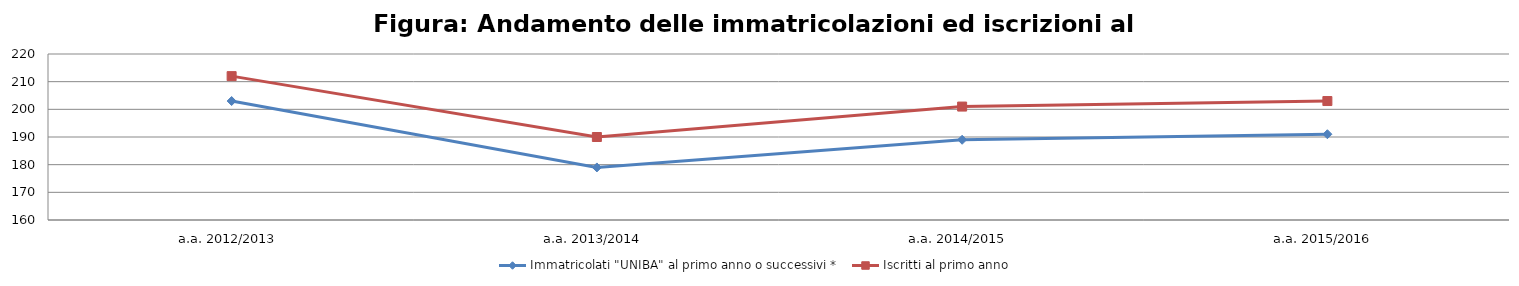
| Category | Immatricolati "UNIBA" al primo anno o successivi * | Iscritti al primo anno  |
|---|---|---|
| a.a. 2012/2013 | 203 | 212 |
| a.a. 2013/2014 | 179 | 190 |
| a.a. 2014/2015 | 189 | 201 |
| a.a. 2015/2016 | 191 | 203 |